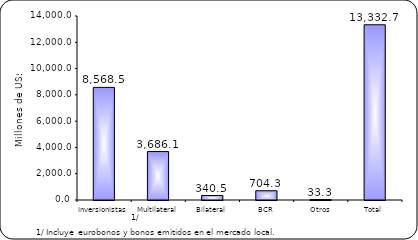
| Category | Series 1 |
|---|---|
| Inversionistas | 8568.5 |
| Multilateral | 3686.1 |
| Bilateral | 340.5 |
| BCR | 704.3 |
| Otros | 33.3 |
| Total | 13332.7 |